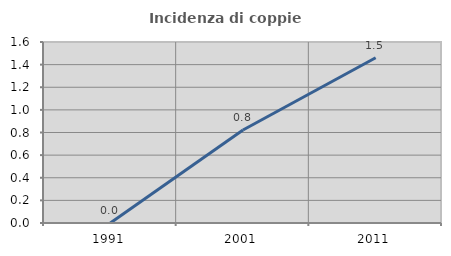
| Category | Incidenza di coppie miste |
|---|---|
| 1991.0 | 0 |
| 2001.0 | 0.822 |
| 2011.0 | 1.461 |